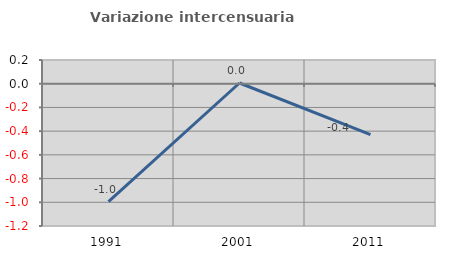
| Category | Variazione intercensuaria annua |
|---|---|
| 1991.0 | -0.994 |
| 2001.0 | 0.006 |
| 2011.0 | -0.429 |